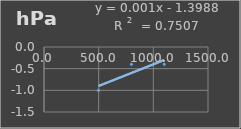
| Category | Presión Atmosférica |
|---|---|
| 499.0 | -1 |
| 799.8 | -0.4 |
| 1099.8 | -0.4 |